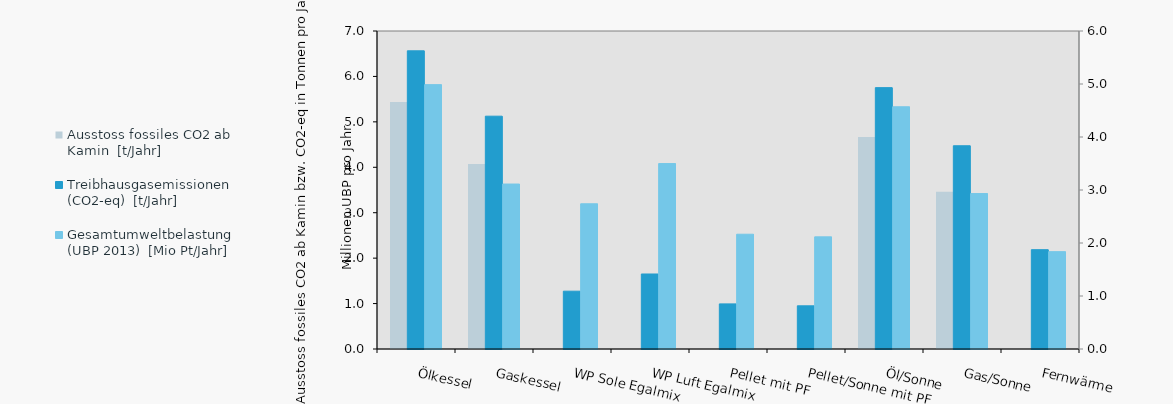
| Category | Ausstoss fossiles CO2 ab Kamin | Treibhausgasemissionen (CO2-eq) | Series 4 |
|---|---|---|---|
| Ölkessel | 5.436 | 6.564 |  |
| Gaskessel | 4.072 | 5.125 |  |
| WP Sole Egalmix | 0 | 1.273 |  |
| WP Luft Egalmix | 0 | 1.651 |  |
| Pellet mit PF | 0 | 0.993 |  |
| Pellet/Sonne mit PF | 0 | 0.951 |  |
| Öl/Sonne | 4.667 | 5.753 |  |
| Gas/Sonne | 3.461 | 4.474 |  |
| Fernwärme | 0 | 2.186 |  |